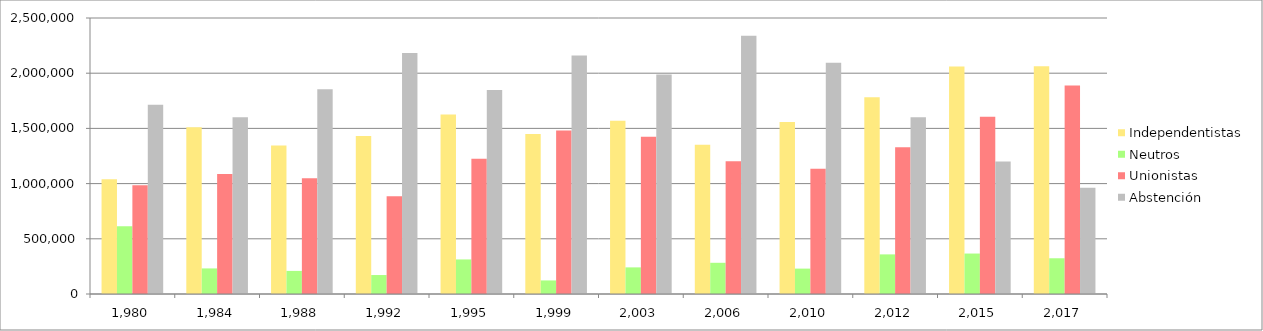
| Category | Independentistas | Neutros | Unionistas | Abstención |
|---|---|---|---|---|
| 1980.0 | 1038612 | 612690 | 985450 | 1713888 |
| 1984.0 | 1509617 | 231711 | 1087882 | 1601854 |
| 1988.0 | 1344161 | 209211 | 1049420 | 1854704 |
| 1992.0 | 1431599 | 171794 | 886083 | 2184020 |
| 1995.0 | 1625938 | 313092 | 1224004 | 1847022 |
| 1999.0 | 1449593 | 122895 | 1480564 | 2159731 |
| 2003.0 | 1568749 | 241163 | 1424953 | 1988561 |
| 2006.0 | 1352111 | 282693 | 1202235 | 2339166 |
| 2010.0 | 1558811 | 229985 | 1135341 | 2095122 |
| 2012.0 | 1781460 | 358857 | 1329597 | 1600510 |
| 2015.0 | 2060218 | 366494 | 1605563 | 1199106 |
| 2017.0 | 2063361 | 323695 | 1889176 | 961426 |